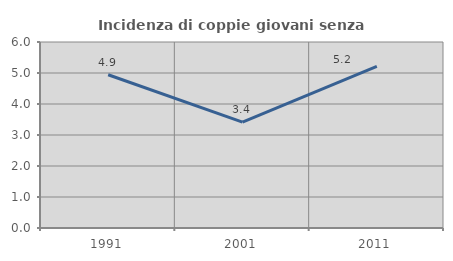
| Category | Incidenza di coppie giovani senza figli |
|---|---|
| 1991.0 | 4.943 |
| 2001.0 | 3.416 |
| 2011.0 | 5.21 |